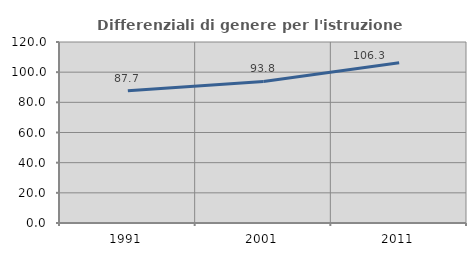
| Category | Differenziali di genere per l'istruzione superiore |
|---|---|
| 1991.0 | 87.693 |
| 2001.0 | 93.844 |
| 2011.0 | 106.291 |